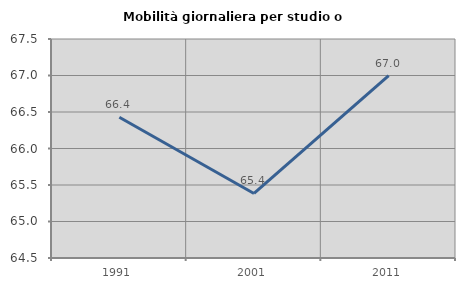
| Category | Mobilità giornaliera per studio o lavoro |
|---|---|
| 1991.0 | 66.429 |
| 2001.0 | 65.385 |
| 2011.0 | 66.997 |